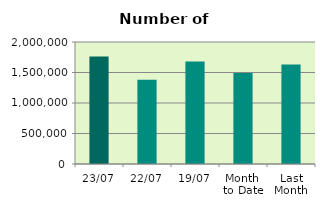
| Category | Series 0 |
|---|---|
| 23/07 | 1762480 |
| 22/07 | 1380680 |
| 19/07 | 1681574 |
| Month 
to Date | 1491554.471 |
| Last
Month | 1630183.4 |